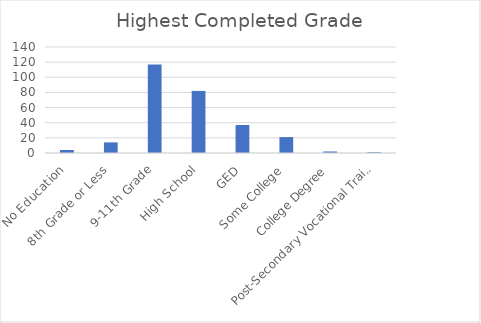
| Category | Series 0 |
|---|---|
| No Education | 4 |
| 8th Grade or Less | 14 |
| 9-11th Grade | 117 |
| High School | 82 |
| GED | 37 |
| Some College | 21 |
| College Degree | 2 |
| Post-Secondary Vocational Training | 1 |